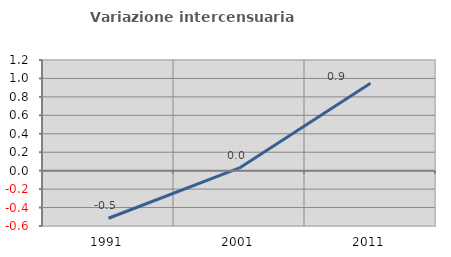
| Category | Variazione intercensuaria annua |
|---|---|
| 1991.0 | -0.516 |
| 2001.0 | 0.029 |
| 2011.0 | 0.947 |